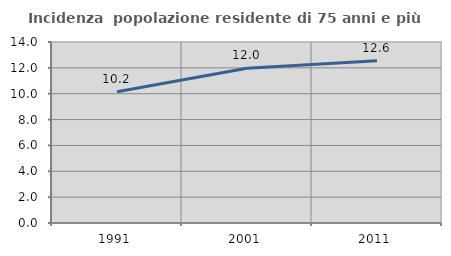
| Category | Incidenza  popolazione residente di 75 anni e più |
|---|---|
| 1991.0 | 10.158 |
| 2001.0 | 11.972 |
| 2011.0 | 12.55 |